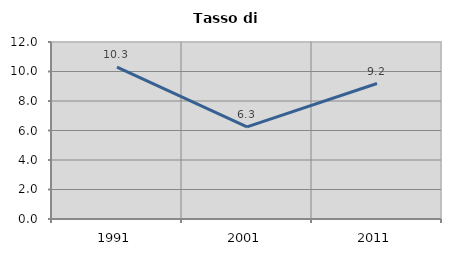
| Category | Tasso di disoccupazione   |
|---|---|
| 1991.0 | 10.294 |
| 2001.0 | 6.25 |
| 2011.0 | 9.184 |